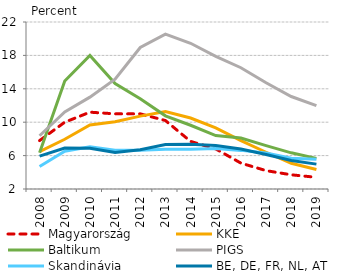
| Category | Magyarország | KKE | Baltikum | PIGS | Skandinávia | BE, DE, FR, NL, AT |
|---|---|---|---|---|---|---|
| 2008 | 7.8 | 6.486 | 6.333 | 8.375 | 4.7 | 5.94 |
| 2009 | 10 | 7.957 | 14.933 | 11.225 | 6.525 | 6.9 |
| 2010 | 11.2 | 9.671 | 18 | 13 | 7.05 | 6.88 |
| 2011 | 11 | 10.057 | 14.633 | 15.15 | 6.65 | 6.36 |
| 2012 | 11 | 10.729 | 12.8 | 18.95 | 6.65 | 6.7 |
| 2013 | 10.2 | 11.286 | 10.767 | 20.55 | 6.775 | 7.32 |
| 2014 | 7.7 | 10.5 | 9.633 | 19.45 | 6.775 | 7.36 |
| 2015 | 6.8 | 9.329 | 8.4 | 17.875 | 6.85 | 7.22 |
| 2016 | 5.1 | 7.786 | 8.1 | 16.525 | 6.625 | 6.78 |
| 2017 | 4.2 | 6.4 | 7.2 | 14.725 | 6.325 | 6.14 |
| 2018 | 3.7 | 5.086 | 6.333 | 13.075 | 5.675 | 5.42 |
| 2019 | 3.4 | 4.329 | 5.667 | 11.975 | 5.55 | 4.98 |